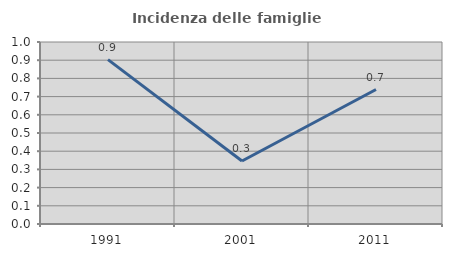
| Category | Incidenza delle famiglie numerose |
|---|---|
| 1991.0 | 0.903 |
| 2001.0 | 0.346 |
| 2011.0 | 0.739 |